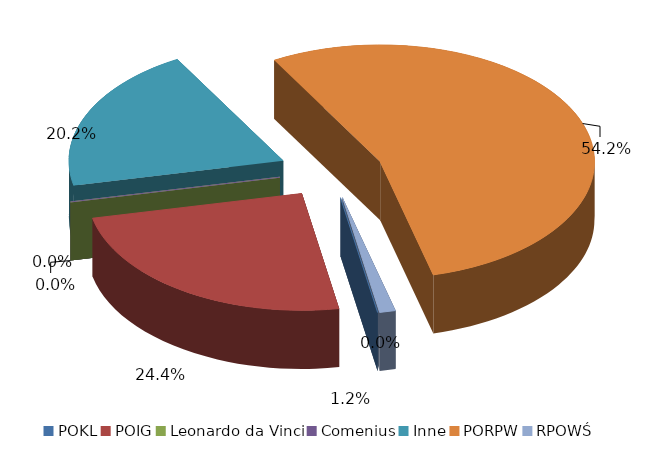
| Category | Series 0 |
|---|---|
| POKL | 0 |
| POIG | 158341.04 |
| Leonardo da Vinci | 0 |
| Comenius | 0 |
| Inne | 130951.36 |
| PORPW | 352293.78 |
| RPOWŚ | 7862.9 |